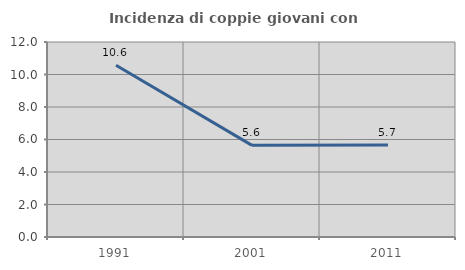
| Category | Incidenza di coppie giovani con figli |
|---|---|
| 1991.0 | 10.574 |
| 2001.0 | 5.641 |
| 2011.0 | 5.668 |